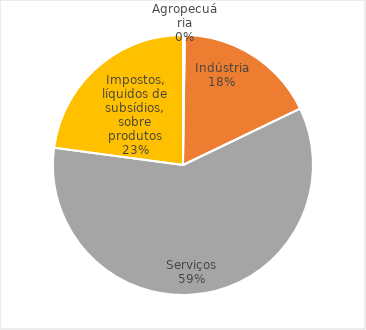
| Category | Series 0 |
|---|---|
| Agropecuária | 176.743 |
| Indústria | 14055.769 |
| Serviços | 47234.33 |
| Impostos, líquidos de subsídios, sobre produtos | 18240.01 |